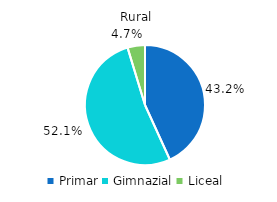
| Category | Series 0 |
|---|---|
| Primar | 43.2 |
| Gimnazial | 52.1 |
| Liceal | 4.7 |